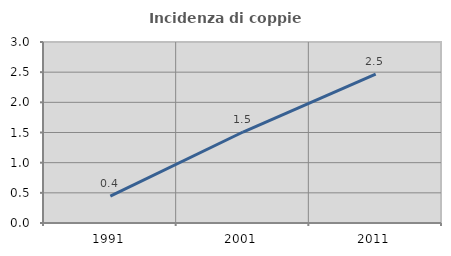
| Category | Incidenza di coppie miste |
|---|---|
| 1991.0 | 0.446 |
| 2001.0 | 1.508 |
| 2011.0 | 2.465 |